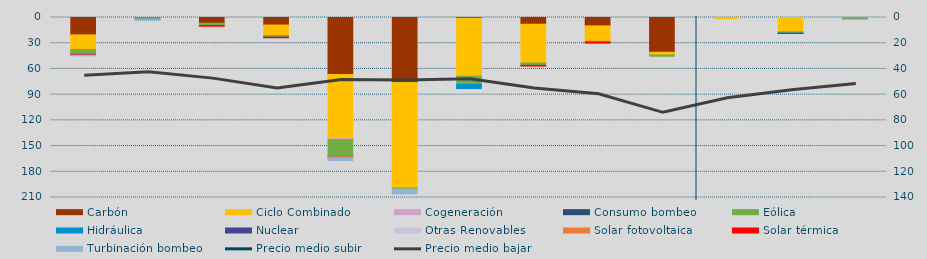
| Category | Carbón | Ciclo Combinado | Cogeneración | Consumo bombeo | Eólica | Hidráulica | Nuclear | Otras Renovables | Solar fotovoltaica | Solar térmica | Turbinación bombeo |
|---|---|---|---|---|---|---|---|---|---|---|---|
| 0 | 20255.7 | 17094 | 0 |  | 5344.3 | 623 |  | 0 | 0 | 617.6 | 755.1 |
| 1 | 158.4 | 0 | 0 |  | 1844.3 | 12 |  | 0 | 0 | 0 | 1460 |
| 2 | 6575 | 0 | 0 |  | 2859 | 0 |  | 0 | 0 | 725.3 | 0 |
| 3 | 8771 | 12552 | 0 |  | 1652.9 | 70 |  | 0 | 0 | 608.7 | 0 |
| 4 | 66423 | 75034.9 | 910.1 |  | 19943.3 | 36 |  | 0 | 1820.4 | 0 | 2822.9 |
| 5 | 75870.4 | 123130.8 | 0 |  | 1278.3 | 0 |  | 288.4 | 0 | 0 | 5090.1 |
| 6 | 802.5 | 67762.6 | 0 |  | 9561.7 | 4762.5 |  | 0 | 0 | 0 | 0 |
| 7 | 7913 | 45184 | 0 |  | 2732.2 | 54.3 |  | 0 | 0 | 784 | 0 |
| 8 | 9798 | 18106.5 | 0 |  | 568.3 | 428.4 |  | 0 | 0 | 944 | 0 |
| 9 | 40570 | 3247 | 0 |  | 1377.6 | 0 |  | 0 | 0 | 0 | 0 |
| 10 | 0 | 1230 | 0 |  | 0 | 0 |  | 0 | 0 | 0 | 0 |
| 11 | 0 | 16736 | 0 |  | 1262.8 | 563.7 |  | 0 | 25.9 | 0.7 | 0 |
| 12 | 0 | 0 | 0 |  | 2064.3 | 0 |  | 0 | 0 | 0 | 200 |